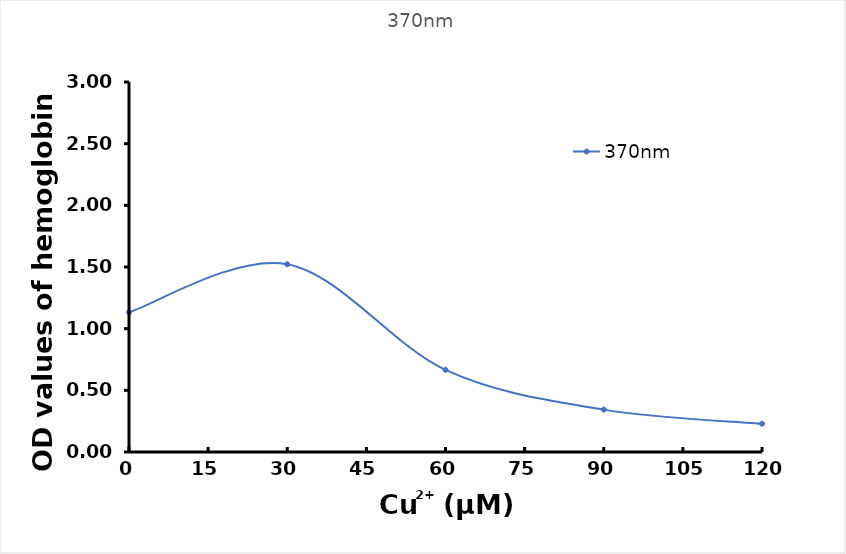
| Category | 370nm |
|---|---|
| 0.0 | 1.133 |
| 30.0 | 1.522 |
| 60.0 | 0.666 |
| 90.0 | 0.344 |
| 120.0 | 0.229 |